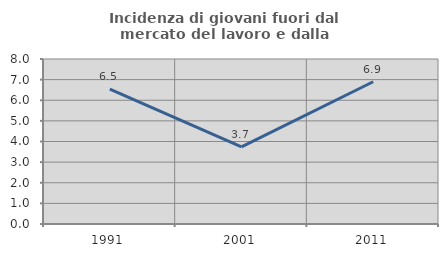
| Category | Incidenza di giovani fuori dal mercato del lavoro e dalla formazione  |
|---|---|
| 1991.0 | 6.542 |
| 2001.0 | 3.738 |
| 2011.0 | 6.897 |